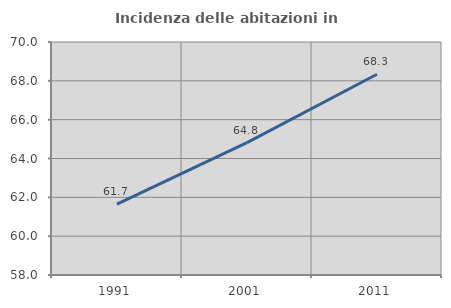
| Category | Incidenza delle abitazioni in proprietà  |
|---|---|
| 1991.0 | 61.654 |
| 2001.0 | 64.815 |
| 2011.0 | 68.34 |